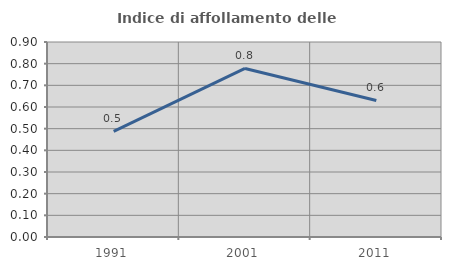
| Category | Indice di affollamento delle abitazioni  |
|---|---|
| 1991.0 | 0.488 |
| 2001.0 | 0.778 |
| 2011.0 | 0.63 |